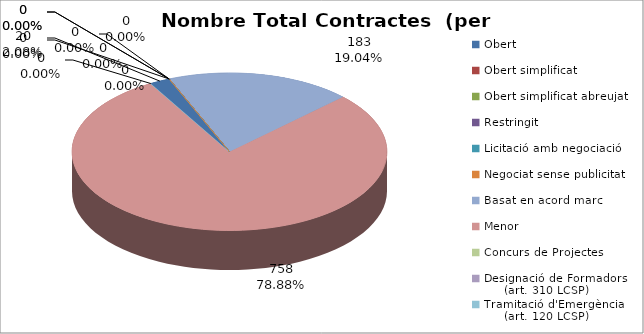
| Category | Nombre Total Contractes |
|---|---|
| Obert | 20 |
| Obert simplificat | 0 |
| Obert simplificat abreujat | 0 |
| Restringit | 0 |
| Licitació amb negociació | 0 |
| Negociat sense publicitat | 0 |
| Basat en acord marc | 183 |
| Menor | 758 |
| Concurs de Projectes | 0 |
| Designació de Formadors
     (art. 310 LCSP) | 0 |
| Tramitació d'Emergència
     (art. 120 LCSP) | 0 |